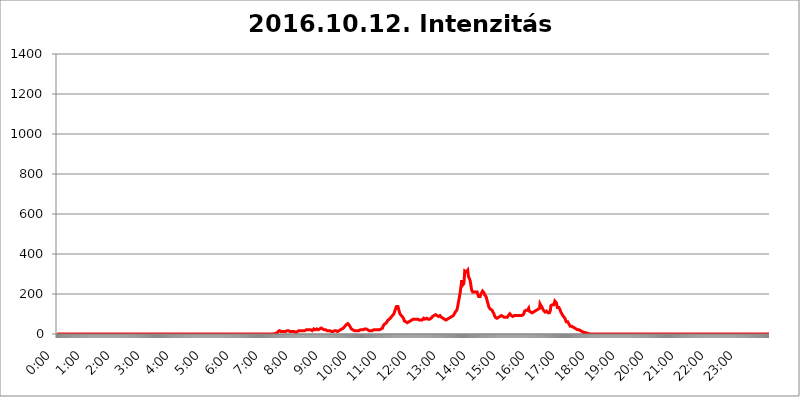
| Category | 2016.10.12. Intenzitás [W/m^2] |
|---|---|
| 0.0 | 0 |
| 0.0006944444444444445 | 0 |
| 0.001388888888888889 | 0 |
| 0.0020833333333333333 | 0 |
| 0.002777777777777778 | 0 |
| 0.003472222222222222 | 0 |
| 0.004166666666666667 | 0 |
| 0.004861111111111111 | 0 |
| 0.005555555555555556 | 0 |
| 0.0062499999999999995 | 0 |
| 0.006944444444444444 | 0 |
| 0.007638888888888889 | 0 |
| 0.008333333333333333 | 0 |
| 0.009027777777777779 | 0 |
| 0.009722222222222222 | 0 |
| 0.010416666666666666 | 0 |
| 0.011111111111111112 | 0 |
| 0.011805555555555555 | 0 |
| 0.012499999999999999 | 0 |
| 0.013194444444444444 | 0 |
| 0.013888888888888888 | 0 |
| 0.014583333333333332 | 0 |
| 0.015277777777777777 | 0 |
| 0.015972222222222224 | 0 |
| 0.016666666666666666 | 0 |
| 0.017361111111111112 | 0 |
| 0.018055555555555557 | 0 |
| 0.01875 | 0 |
| 0.019444444444444445 | 0 |
| 0.02013888888888889 | 0 |
| 0.020833333333333332 | 0 |
| 0.02152777777777778 | 0 |
| 0.022222222222222223 | 0 |
| 0.02291666666666667 | 0 |
| 0.02361111111111111 | 0 |
| 0.024305555555555556 | 0 |
| 0.024999999999999998 | 0 |
| 0.025694444444444447 | 0 |
| 0.02638888888888889 | 0 |
| 0.027083333333333334 | 0 |
| 0.027777777777777776 | 0 |
| 0.02847222222222222 | 0 |
| 0.029166666666666664 | 0 |
| 0.029861111111111113 | 0 |
| 0.030555555555555555 | 0 |
| 0.03125 | 0 |
| 0.03194444444444445 | 0 |
| 0.03263888888888889 | 0 |
| 0.03333333333333333 | 0 |
| 0.034027777777777775 | 0 |
| 0.034722222222222224 | 0 |
| 0.035416666666666666 | 0 |
| 0.036111111111111115 | 0 |
| 0.03680555555555556 | 0 |
| 0.0375 | 0 |
| 0.03819444444444444 | 0 |
| 0.03888888888888889 | 0 |
| 0.03958333333333333 | 0 |
| 0.04027777777777778 | 0 |
| 0.04097222222222222 | 0 |
| 0.041666666666666664 | 0 |
| 0.042361111111111106 | 0 |
| 0.04305555555555556 | 0 |
| 0.043750000000000004 | 0 |
| 0.044444444444444446 | 0 |
| 0.04513888888888889 | 0 |
| 0.04583333333333334 | 0 |
| 0.04652777777777778 | 0 |
| 0.04722222222222222 | 0 |
| 0.04791666666666666 | 0 |
| 0.04861111111111111 | 0 |
| 0.049305555555555554 | 0 |
| 0.049999999999999996 | 0 |
| 0.05069444444444445 | 0 |
| 0.051388888888888894 | 0 |
| 0.052083333333333336 | 0 |
| 0.05277777777777778 | 0 |
| 0.05347222222222222 | 0 |
| 0.05416666666666667 | 0 |
| 0.05486111111111111 | 0 |
| 0.05555555555555555 | 0 |
| 0.05625 | 0 |
| 0.05694444444444444 | 0 |
| 0.057638888888888885 | 0 |
| 0.05833333333333333 | 0 |
| 0.05902777777777778 | 0 |
| 0.059722222222222225 | 0 |
| 0.06041666666666667 | 0 |
| 0.061111111111111116 | 0 |
| 0.06180555555555556 | 0 |
| 0.0625 | 0 |
| 0.06319444444444444 | 0 |
| 0.06388888888888888 | 0 |
| 0.06458333333333334 | 0 |
| 0.06527777777777778 | 0 |
| 0.06597222222222222 | 0 |
| 0.06666666666666667 | 0 |
| 0.06736111111111111 | 0 |
| 0.06805555555555555 | 0 |
| 0.06874999999999999 | 0 |
| 0.06944444444444443 | 0 |
| 0.07013888888888889 | 0 |
| 0.07083333333333333 | 0 |
| 0.07152777777777779 | 0 |
| 0.07222222222222223 | 0 |
| 0.07291666666666667 | 0 |
| 0.07361111111111111 | 0 |
| 0.07430555555555556 | 0 |
| 0.075 | 0 |
| 0.07569444444444444 | 0 |
| 0.0763888888888889 | 0 |
| 0.07708333333333334 | 0 |
| 0.07777777777777778 | 0 |
| 0.07847222222222222 | 0 |
| 0.07916666666666666 | 0 |
| 0.0798611111111111 | 0 |
| 0.08055555555555556 | 0 |
| 0.08125 | 0 |
| 0.08194444444444444 | 0 |
| 0.08263888888888889 | 0 |
| 0.08333333333333333 | 0 |
| 0.08402777777777777 | 0 |
| 0.08472222222222221 | 0 |
| 0.08541666666666665 | 0 |
| 0.08611111111111112 | 0 |
| 0.08680555555555557 | 0 |
| 0.08750000000000001 | 0 |
| 0.08819444444444445 | 0 |
| 0.08888888888888889 | 0 |
| 0.08958333333333333 | 0 |
| 0.09027777777777778 | 0 |
| 0.09097222222222222 | 0 |
| 0.09166666666666667 | 0 |
| 0.09236111111111112 | 0 |
| 0.09305555555555556 | 0 |
| 0.09375 | 0 |
| 0.09444444444444444 | 0 |
| 0.09513888888888888 | 0 |
| 0.09583333333333333 | 0 |
| 0.09652777777777777 | 0 |
| 0.09722222222222222 | 0 |
| 0.09791666666666667 | 0 |
| 0.09861111111111111 | 0 |
| 0.09930555555555555 | 0 |
| 0.09999999999999999 | 0 |
| 0.10069444444444443 | 0 |
| 0.1013888888888889 | 0 |
| 0.10208333333333335 | 0 |
| 0.10277777777777779 | 0 |
| 0.10347222222222223 | 0 |
| 0.10416666666666667 | 0 |
| 0.10486111111111111 | 0 |
| 0.10555555555555556 | 0 |
| 0.10625 | 0 |
| 0.10694444444444444 | 0 |
| 0.1076388888888889 | 0 |
| 0.10833333333333334 | 0 |
| 0.10902777777777778 | 0 |
| 0.10972222222222222 | 0 |
| 0.1111111111111111 | 0 |
| 0.11180555555555556 | 0 |
| 0.11180555555555556 | 0 |
| 0.1125 | 0 |
| 0.11319444444444444 | 0 |
| 0.11388888888888889 | 0 |
| 0.11458333333333333 | 0 |
| 0.11527777777777777 | 0 |
| 0.11597222222222221 | 0 |
| 0.11666666666666665 | 0 |
| 0.1173611111111111 | 0 |
| 0.11805555555555557 | 0 |
| 0.11944444444444445 | 0 |
| 0.12013888888888889 | 0 |
| 0.12083333333333333 | 0 |
| 0.12152777777777778 | 0 |
| 0.12222222222222223 | 0 |
| 0.12291666666666667 | 0 |
| 0.12291666666666667 | 0 |
| 0.12361111111111112 | 0 |
| 0.12430555555555556 | 0 |
| 0.125 | 0 |
| 0.12569444444444444 | 0 |
| 0.12638888888888888 | 0 |
| 0.12708333333333333 | 0 |
| 0.16875 | 0 |
| 0.12847222222222224 | 0 |
| 0.12916666666666668 | 0 |
| 0.12986111111111112 | 0 |
| 0.13055555555555556 | 0 |
| 0.13125 | 0 |
| 0.13194444444444445 | 0 |
| 0.1326388888888889 | 0 |
| 0.13333333333333333 | 0 |
| 0.13402777777777777 | 0 |
| 0.13402777777777777 | 0 |
| 0.13472222222222222 | 0 |
| 0.13541666666666666 | 0 |
| 0.1361111111111111 | 0 |
| 0.13749999999999998 | 0 |
| 0.13819444444444443 | 0 |
| 0.1388888888888889 | 0 |
| 0.13958333333333334 | 0 |
| 0.14027777777777778 | 0 |
| 0.14097222222222222 | 0 |
| 0.14166666666666666 | 0 |
| 0.1423611111111111 | 0 |
| 0.14305555555555557 | 0 |
| 0.14375000000000002 | 0 |
| 0.14444444444444446 | 0 |
| 0.1451388888888889 | 0 |
| 0.1451388888888889 | 0 |
| 0.14652777777777778 | 0 |
| 0.14722222222222223 | 0 |
| 0.14791666666666667 | 0 |
| 0.1486111111111111 | 0 |
| 0.14930555555555555 | 0 |
| 0.15 | 0 |
| 0.15069444444444444 | 0 |
| 0.15138888888888888 | 0 |
| 0.15208333333333332 | 0 |
| 0.15277777777777776 | 0 |
| 0.15347222222222223 | 0 |
| 0.15416666666666667 | 0 |
| 0.15486111111111112 | 0 |
| 0.15555555555555556 | 0 |
| 0.15625 | 0 |
| 0.15694444444444444 | 0 |
| 0.15763888888888888 | 0 |
| 0.15833333333333333 | 0 |
| 0.15902777777777777 | 0 |
| 0.15972222222222224 | 0 |
| 0.16041666666666668 | 0 |
| 0.16111111111111112 | 0 |
| 0.16180555555555556 | 0 |
| 0.1625 | 0 |
| 0.16319444444444445 | 0 |
| 0.1638888888888889 | 0 |
| 0.16458333333333333 | 0 |
| 0.16527777777777777 | 0 |
| 0.16597222222222222 | 0 |
| 0.16666666666666666 | 0 |
| 0.1673611111111111 | 0 |
| 0.16805555555555554 | 0 |
| 0.16874999999999998 | 0 |
| 0.16944444444444443 | 0 |
| 0.17013888888888887 | 0 |
| 0.1708333333333333 | 0 |
| 0.17152777777777775 | 0 |
| 0.17222222222222225 | 0 |
| 0.1729166666666667 | 0 |
| 0.17361111111111113 | 0 |
| 0.17430555555555557 | 0 |
| 0.17500000000000002 | 0 |
| 0.17569444444444446 | 0 |
| 0.1763888888888889 | 0 |
| 0.17708333333333334 | 0 |
| 0.17777777777777778 | 0 |
| 0.17847222222222223 | 0 |
| 0.17916666666666667 | 0 |
| 0.1798611111111111 | 0 |
| 0.18055555555555555 | 0 |
| 0.18125 | 0 |
| 0.18194444444444444 | 0 |
| 0.1826388888888889 | 0 |
| 0.18333333333333335 | 0 |
| 0.1840277777777778 | 0 |
| 0.18472222222222223 | 0 |
| 0.18541666666666667 | 0 |
| 0.18611111111111112 | 0 |
| 0.18680555555555556 | 0 |
| 0.1875 | 0 |
| 0.18819444444444444 | 0 |
| 0.18888888888888888 | 0 |
| 0.18958333333333333 | 0 |
| 0.19027777777777777 | 0 |
| 0.1909722222222222 | 0 |
| 0.19166666666666665 | 0 |
| 0.19236111111111112 | 0 |
| 0.19305555555555554 | 0 |
| 0.19375 | 0 |
| 0.19444444444444445 | 0 |
| 0.1951388888888889 | 0 |
| 0.19583333333333333 | 0 |
| 0.19652777777777777 | 0 |
| 0.19722222222222222 | 0 |
| 0.19791666666666666 | 0 |
| 0.1986111111111111 | 0 |
| 0.19930555555555554 | 0 |
| 0.19999999999999998 | 0 |
| 0.20069444444444443 | 0 |
| 0.20138888888888887 | 0 |
| 0.2020833333333333 | 0 |
| 0.2027777777777778 | 0 |
| 0.2034722222222222 | 0 |
| 0.2041666666666667 | 0 |
| 0.20486111111111113 | 0 |
| 0.20555555555555557 | 0 |
| 0.20625000000000002 | 0 |
| 0.20694444444444446 | 0 |
| 0.2076388888888889 | 0 |
| 0.20833333333333334 | 0 |
| 0.20902777777777778 | 0 |
| 0.20972222222222223 | 0 |
| 0.21041666666666667 | 0 |
| 0.2111111111111111 | 0 |
| 0.21180555555555555 | 0 |
| 0.2125 | 0 |
| 0.21319444444444444 | 0 |
| 0.2138888888888889 | 0 |
| 0.21458333333333335 | 0 |
| 0.2152777777777778 | 0 |
| 0.21597222222222223 | 0 |
| 0.21666666666666667 | 0 |
| 0.21736111111111112 | 0 |
| 0.21805555555555556 | 0 |
| 0.21875 | 0 |
| 0.21944444444444444 | 0 |
| 0.22013888888888888 | 0 |
| 0.22083333333333333 | 0 |
| 0.22152777777777777 | 0 |
| 0.2222222222222222 | 0 |
| 0.22291666666666665 | 0 |
| 0.2236111111111111 | 0 |
| 0.22430555555555556 | 0 |
| 0.225 | 0 |
| 0.22569444444444445 | 0 |
| 0.2263888888888889 | 0 |
| 0.22708333333333333 | 0 |
| 0.22777777777777777 | 0 |
| 0.22847222222222222 | 0 |
| 0.22916666666666666 | 0 |
| 0.2298611111111111 | 0 |
| 0.23055555555555554 | 0 |
| 0.23124999999999998 | 0 |
| 0.23194444444444443 | 0 |
| 0.23263888888888887 | 0 |
| 0.2333333333333333 | 0 |
| 0.2340277777777778 | 0 |
| 0.2347222222222222 | 0 |
| 0.2354166666666667 | 0 |
| 0.23611111111111113 | 0 |
| 0.23680555555555557 | 0 |
| 0.23750000000000002 | 0 |
| 0.23819444444444446 | 0 |
| 0.2388888888888889 | 0 |
| 0.23958333333333334 | 0 |
| 0.24027777777777778 | 0 |
| 0.24097222222222223 | 0 |
| 0.24166666666666667 | 0 |
| 0.2423611111111111 | 0 |
| 0.24305555555555555 | 0 |
| 0.24375 | 0 |
| 0.24444444444444446 | 0 |
| 0.24513888888888888 | 0 |
| 0.24583333333333335 | 0 |
| 0.2465277777777778 | 0 |
| 0.24722222222222223 | 0 |
| 0.24791666666666667 | 0 |
| 0.24861111111111112 | 0 |
| 0.24930555555555556 | 0 |
| 0.25 | 0 |
| 0.25069444444444444 | 0 |
| 0.2513888888888889 | 0 |
| 0.2520833333333333 | 0 |
| 0.25277777777777777 | 0 |
| 0.2534722222222222 | 0 |
| 0.25416666666666665 | 0 |
| 0.2548611111111111 | 0 |
| 0.2555555555555556 | 0 |
| 0.25625000000000003 | 0 |
| 0.2569444444444445 | 0 |
| 0.2576388888888889 | 0 |
| 0.25833333333333336 | 0 |
| 0.2590277777777778 | 0 |
| 0.25972222222222224 | 0 |
| 0.2604166666666667 | 0 |
| 0.2611111111111111 | 0 |
| 0.26180555555555557 | 0 |
| 0.2625 | 0 |
| 0.26319444444444445 | 0 |
| 0.2638888888888889 | 0 |
| 0.26458333333333334 | 0 |
| 0.2652777777777778 | 0 |
| 0.2659722222222222 | 0 |
| 0.26666666666666666 | 0 |
| 0.2673611111111111 | 0 |
| 0.26805555555555555 | 0 |
| 0.26875 | 0 |
| 0.26944444444444443 | 0 |
| 0.2701388888888889 | 0 |
| 0.2708333333333333 | 0 |
| 0.27152777777777776 | 0 |
| 0.2722222222222222 | 0 |
| 0.27291666666666664 | 0 |
| 0.2736111111111111 | 0 |
| 0.2743055555555555 | 0 |
| 0.27499999999999997 | 0 |
| 0.27569444444444446 | 0 |
| 0.27638888888888885 | 0 |
| 0.27708333333333335 | 0 |
| 0.2777777777777778 | 0 |
| 0.27847222222222223 | 0 |
| 0.2791666666666667 | 0 |
| 0.2798611111111111 | 0 |
| 0.28055555555555556 | 0 |
| 0.28125 | 0 |
| 0.28194444444444444 | 0 |
| 0.2826388888888889 | 0 |
| 0.2833333333333333 | 0 |
| 0.28402777777777777 | 0 |
| 0.2847222222222222 | 0 |
| 0.28541666666666665 | 0 |
| 0.28611111111111115 | 0 |
| 0.28680555555555554 | 0 |
| 0.28750000000000003 | 0 |
| 0.2881944444444445 | 0 |
| 0.2888888888888889 | 0 |
| 0.28958333333333336 | 0 |
| 0.2902777777777778 | 0 |
| 0.29097222222222224 | 0 |
| 0.2916666666666667 | 0 |
| 0.2923611111111111 | 0 |
| 0.29305555555555557 | 0 |
| 0.29375 | 0 |
| 0.29444444444444445 | 0 |
| 0.2951388888888889 | 0 |
| 0.29583333333333334 | 0 |
| 0.2965277777777778 | 0 |
| 0.2972222222222222 | 0 |
| 0.29791666666666666 | 0 |
| 0.2986111111111111 | 0 |
| 0.29930555555555555 | 0 |
| 0.3 | 0 |
| 0.30069444444444443 | 0 |
| 0.3013888888888889 | 0 |
| 0.3020833333333333 | 0 |
| 0.30277777777777776 | 0 |
| 0.3034722222222222 | 0 |
| 0.30416666666666664 | 0 |
| 0.3048611111111111 | 0 |
| 0.3055555555555555 | 0 |
| 0.30624999999999997 | 3.525 |
| 0.3069444444444444 | 3.525 |
| 0.3076388888888889 | 3.525 |
| 0.30833333333333335 | 3.525 |
| 0.3090277777777778 | 7.887 |
| 0.30972222222222223 | 12.257 |
| 0.3104166666666667 | 12.257 |
| 0.3111111111111111 | 16.636 |
| 0.31180555555555556 | 16.636 |
| 0.3125 | 16.636 |
| 0.31319444444444444 | 16.636 |
| 0.3138888888888889 | 12.257 |
| 0.3145833333333333 | 12.257 |
| 0.31527777777777777 | 12.257 |
| 0.3159722222222222 | 12.257 |
| 0.31666666666666665 | 12.257 |
| 0.31736111111111115 | 12.257 |
| 0.31805555555555554 | 12.257 |
| 0.31875000000000003 | 12.257 |
| 0.3194444444444445 | 12.257 |
| 0.3201388888888889 | 12.257 |
| 0.32083333333333336 | 16.636 |
| 0.3215277777777778 | 16.636 |
| 0.32222222222222224 | 16.636 |
| 0.3229166666666667 | 16.636 |
| 0.3236111111111111 | 16.636 |
| 0.32430555555555557 | 16.636 |
| 0.325 | 16.636 |
| 0.32569444444444445 | 12.257 |
| 0.3263888888888889 | 12.257 |
| 0.32708333333333334 | 12.257 |
| 0.3277777777777778 | 12.257 |
| 0.3284722222222222 | 12.257 |
| 0.32916666666666666 | 12.257 |
| 0.3298611111111111 | 12.257 |
| 0.33055555555555555 | 12.257 |
| 0.33125 | 12.257 |
| 0.33194444444444443 | 7.887 |
| 0.3326388888888889 | 12.257 |
| 0.3333333333333333 | 7.887 |
| 0.3340277777777778 | 7.887 |
| 0.3347222222222222 | 7.887 |
| 0.3354166666666667 | 7.887 |
| 0.3361111111111111 | 12.257 |
| 0.3368055555555556 | 12.257 |
| 0.33749999999999997 | 12.257 |
| 0.33819444444444446 | 16.636 |
| 0.33888888888888885 | 16.636 |
| 0.33958333333333335 | 16.636 |
| 0.34027777777777773 | 16.636 |
| 0.34097222222222223 | 16.636 |
| 0.3416666666666666 | 16.636 |
| 0.3423611111111111 | 16.636 |
| 0.3430555555555555 | 16.636 |
| 0.34375 | 16.636 |
| 0.3444444444444445 | 16.636 |
| 0.3451388888888889 | 16.636 |
| 0.3458333333333334 | 16.636 |
| 0.34652777777777777 | 16.636 |
| 0.34722222222222227 | 16.636 |
| 0.34791666666666665 | 16.636 |
| 0.34861111111111115 | 16.636 |
| 0.34930555555555554 | 21.024 |
| 0.35000000000000003 | 21.024 |
| 0.3506944444444444 | 21.024 |
| 0.3513888888888889 | 21.024 |
| 0.3520833333333333 | 21.024 |
| 0.3527777777777778 | 21.024 |
| 0.3534722222222222 | 21.024 |
| 0.3541666666666667 | 21.024 |
| 0.3548611111111111 | 21.024 |
| 0.35555555555555557 | 21.024 |
| 0.35625 | 21.024 |
| 0.35694444444444445 | 16.636 |
| 0.3576388888888889 | 16.636 |
| 0.35833333333333334 | 21.024 |
| 0.3590277777777778 | 21.024 |
| 0.3597222222222222 | 25.419 |
| 0.36041666666666666 | 25.419 |
| 0.3611111111111111 | 25.419 |
| 0.36180555555555555 | 21.024 |
| 0.3625 | 21.024 |
| 0.36319444444444443 | 21.024 |
| 0.3638888888888889 | 25.419 |
| 0.3645833333333333 | 25.419 |
| 0.3652777777777778 | 21.024 |
| 0.3659722222222222 | 21.024 |
| 0.3666666666666667 | 21.024 |
| 0.3673611111111111 | 21.024 |
| 0.3680555555555556 | 25.419 |
| 0.36874999999999997 | 25.419 |
| 0.36944444444444446 | 25.419 |
| 0.37013888888888885 | 29.823 |
| 0.37083333333333335 | 29.823 |
| 0.37152777777777773 | 29.823 |
| 0.37222222222222223 | 25.419 |
| 0.3729166666666666 | 21.024 |
| 0.3736111111111111 | 21.024 |
| 0.3743055555555555 | 21.024 |
| 0.375 | 21.024 |
| 0.3756944444444445 | 21.024 |
| 0.3763888888888889 | 21.024 |
| 0.3770833333333334 | 16.636 |
| 0.37777777777777777 | 16.636 |
| 0.37847222222222227 | 16.636 |
| 0.37916666666666665 | 16.636 |
| 0.37986111111111115 | 16.636 |
| 0.38055555555555554 | 16.636 |
| 0.38125000000000003 | 16.636 |
| 0.3819444444444444 | 16.636 |
| 0.3826388888888889 | 16.636 |
| 0.3833333333333333 | 16.636 |
| 0.3840277777777778 | 16.636 |
| 0.3847222222222222 | 12.257 |
| 0.3854166666666667 | 16.636 |
| 0.3861111111111111 | 12.257 |
| 0.38680555555555557 | 12.257 |
| 0.3875 | 12.257 |
| 0.38819444444444445 | 16.636 |
| 0.3888888888888889 | 16.636 |
| 0.38958333333333334 | 16.636 |
| 0.3902777777777778 | 16.636 |
| 0.3909722222222222 | 16.636 |
| 0.39166666666666666 | 16.636 |
| 0.3923611111111111 | 12.257 |
| 0.39305555555555555 | 12.257 |
| 0.39375 | 12.257 |
| 0.39444444444444443 | 12.257 |
| 0.3951388888888889 | 16.636 |
| 0.3958333333333333 | 16.636 |
| 0.3965277777777778 | 21.024 |
| 0.3972222222222222 | 21.024 |
| 0.3979166666666667 | 21.024 |
| 0.3986111111111111 | 21.024 |
| 0.3993055555555556 | 25.419 |
| 0.39999999999999997 | 25.419 |
| 0.40069444444444446 | 25.419 |
| 0.40138888888888885 | 29.823 |
| 0.40208333333333335 | 29.823 |
| 0.40277777777777773 | 34.234 |
| 0.40347222222222223 | 38.653 |
| 0.4041666666666666 | 38.653 |
| 0.4048611111111111 | 43.079 |
| 0.4055555555555555 | 47.511 |
| 0.40625 | 47.511 |
| 0.4069444444444445 | 51.951 |
| 0.4076388888888889 | 51.951 |
| 0.4083333333333334 | 51.951 |
| 0.40902777777777777 | 47.511 |
| 0.40972222222222227 | 43.079 |
| 0.41041666666666665 | 38.653 |
| 0.41111111111111115 | 34.234 |
| 0.41180555555555554 | 29.823 |
| 0.41250000000000003 | 25.419 |
| 0.4131944444444444 | 21.024 |
| 0.4138888888888889 | 21.024 |
| 0.4145833333333333 | 21.024 |
| 0.4152777777777778 | 16.636 |
| 0.4159722222222222 | 16.636 |
| 0.4166666666666667 | 16.636 |
| 0.4173611111111111 | 16.636 |
| 0.41805555555555557 | 16.636 |
| 0.41875 | 16.636 |
| 0.41944444444444445 | 16.636 |
| 0.4201388888888889 | 16.636 |
| 0.42083333333333334 | 16.636 |
| 0.4215277777777778 | 16.636 |
| 0.4222222222222222 | 16.636 |
| 0.42291666666666666 | 16.636 |
| 0.4236111111111111 | 21.024 |
| 0.42430555555555555 | 21.024 |
| 0.425 | 21.024 |
| 0.42569444444444443 | 21.024 |
| 0.4263888888888889 | 21.024 |
| 0.4270833333333333 | 21.024 |
| 0.4277777777777778 | 21.024 |
| 0.4284722222222222 | 21.024 |
| 0.4291666666666667 | 21.024 |
| 0.4298611111111111 | 21.024 |
| 0.4305555555555556 | 25.419 |
| 0.43124999999999997 | 25.419 |
| 0.43194444444444446 | 25.419 |
| 0.43263888888888885 | 25.419 |
| 0.43333333333333335 | 25.419 |
| 0.43402777777777773 | 25.419 |
| 0.43472222222222223 | 25.419 |
| 0.4354166666666666 | 21.024 |
| 0.4361111111111111 | 21.024 |
| 0.4368055555555555 | 21.024 |
| 0.4375 | 16.636 |
| 0.4381944444444445 | 16.636 |
| 0.4388888888888889 | 16.636 |
| 0.4395833333333334 | 16.636 |
| 0.44027777777777777 | 16.636 |
| 0.44097222222222227 | 16.636 |
| 0.44166666666666665 | 16.636 |
| 0.44236111111111115 | 21.024 |
| 0.44305555555555554 | 21.024 |
| 0.44375000000000003 | 21.024 |
| 0.4444444444444444 | 21.024 |
| 0.4451388888888889 | 21.024 |
| 0.4458333333333333 | 21.024 |
| 0.4465277777777778 | 21.024 |
| 0.4472222222222222 | 21.024 |
| 0.4479166666666667 | 21.024 |
| 0.4486111111111111 | 21.024 |
| 0.44930555555555557 | 21.024 |
| 0.45 | 21.024 |
| 0.45069444444444445 | 21.024 |
| 0.4513888888888889 | 21.024 |
| 0.45208333333333334 | 21.024 |
| 0.4527777777777778 | 21.024 |
| 0.4534722222222222 | 21.024 |
| 0.45416666666666666 | 25.419 |
| 0.4548611111111111 | 25.419 |
| 0.45555555555555555 | 29.823 |
| 0.45625 | 29.823 |
| 0.45694444444444443 | 38.653 |
| 0.4576388888888889 | 43.079 |
| 0.4583333333333333 | 47.511 |
| 0.4590277777777778 | 47.511 |
| 0.4597222222222222 | 47.511 |
| 0.4604166666666667 | 51.951 |
| 0.4611111111111111 | 51.951 |
| 0.4618055555555556 | 56.398 |
| 0.46249999999999997 | 60.85 |
| 0.46319444444444446 | 65.31 |
| 0.46388888888888885 | 69.775 |
| 0.46458333333333335 | 69.775 |
| 0.46527777777777773 | 74.246 |
| 0.46597222222222223 | 74.246 |
| 0.4666666666666666 | 74.246 |
| 0.4673611111111111 | 78.722 |
| 0.4680555555555555 | 83.205 |
| 0.46875 | 83.205 |
| 0.4694444444444445 | 87.692 |
| 0.4701388888888889 | 92.184 |
| 0.4708333333333334 | 96.682 |
| 0.47152777777777777 | 96.682 |
| 0.47222222222222227 | 101.184 |
| 0.47291666666666665 | 110.201 |
| 0.47361111111111115 | 114.716 |
| 0.47430555555555554 | 123.758 |
| 0.47500000000000003 | 128.284 |
| 0.4756944444444444 | 137.347 |
| 0.4763888888888889 | 137.347 |
| 0.4770833333333333 | 141.884 |
| 0.4777777777777778 | 137.347 |
| 0.4784722222222222 | 128.284 |
| 0.4791666666666667 | 119.235 |
| 0.4798611111111111 | 110.201 |
| 0.48055555555555557 | 101.184 |
| 0.48125 | 96.682 |
| 0.48194444444444445 | 96.682 |
| 0.4826388888888889 | 92.184 |
| 0.48333333333333334 | 92.184 |
| 0.4840277777777778 | 92.184 |
| 0.4847222222222222 | 83.205 |
| 0.48541666666666666 | 78.722 |
| 0.4861111111111111 | 74.246 |
| 0.48680555555555555 | 65.31 |
| 0.4875 | 65.31 |
| 0.48819444444444443 | 60.85 |
| 0.4888888888888889 | 60.85 |
| 0.4895833333333333 | 60.85 |
| 0.4902777777777778 | 56.398 |
| 0.4909722222222222 | 56.398 |
| 0.4916666666666667 | 56.398 |
| 0.4923611111111111 | 56.398 |
| 0.4930555555555556 | 60.85 |
| 0.49374999999999997 | 65.31 |
| 0.49444444444444446 | 65.31 |
| 0.49513888888888885 | 65.31 |
| 0.49583333333333335 | 69.775 |
| 0.49652777777777773 | 69.775 |
| 0.49722222222222223 | 69.775 |
| 0.4979166666666666 | 69.775 |
| 0.4986111111111111 | 69.775 |
| 0.4993055555555555 | 74.246 |
| 0.5 | 74.246 |
| 0.5006944444444444 | 74.246 |
| 0.5013888888888889 | 74.246 |
| 0.5020833333333333 | 74.246 |
| 0.5027777777777778 | 74.246 |
| 0.5034722222222222 | 74.246 |
| 0.5041666666666667 | 78.722 |
| 0.5048611111111111 | 74.246 |
| 0.5055555555555555 | 74.246 |
| 0.50625 | 74.246 |
| 0.5069444444444444 | 69.775 |
| 0.5076388888888889 | 69.775 |
| 0.5083333333333333 | 69.775 |
| 0.5090277777777777 | 69.775 |
| 0.5097222222222222 | 69.775 |
| 0.5104166666666666 | 69.775 |
| 0.5111111111111112 | 69.775 |
| 0.5118055555555555 | 69.775 |
| 0.5125000000000001 | 69.775 |
| 0.5131944444444444 | 74.246 |
| 0.513888888888889 | 78.722 |
| 0.5145833333333333 | 78.722 |
| 0.5152777777777778 | 78.722 |
| 0.5159722222222222 | 74.246 |
| 0.5166666666666667 | 74.246 |
| 0.517361111111111 | 74.246 |
| 0.5180555555555556 | 78.722 |
| 0.5187499999999999 | 78.722 |
| 0.5194444444444445 | 78.722 |
| 0.5201388888888888 | 74.246 |
| 0.5208333333333334 | 74.246 |
| 0.5215277777777778 | 74.246 |
| 0.5222222222222223 | 74.246 |
| 0.5229166666666667 | 69.775 |
| 0.5236111111111111 | 74.246 |
| 0.5243055555555556 | 78.722 |
| 0.525 | 78.722 |
| 0.5256944444444445 | 83.205 |
| 0.5263888888888889 | 87.692 |
| 0.5270833333333333 | 92.184 |
| 0.5277777777777778 | 92.184 |
| 0.5284722222222222 | 92.184 |
| 0.5291666666666667 | 96.682 |
| 0.5298611111111111 | 96.682 |
| 0.5305555555555556 | 96.682 |
| 0.53125 | 96.682 |
| 0.5319444444444444 | 92.184 |
| 0.5326388888888889 | 92.184 |
| 0.5333333333333333 | 87.692 |
| 0.5340277777777778 | 87.692 |
| 0.5347222222222222 | 87.692 |
| 0.5354166666666667 | 92.184 |
| 0.5361111111111111 | 92.184 |
| 0.5368055555555555 | 92.184 |
| 0.5375 | 92.184 |
| 0.5381944444444444 | 87.692 |
| 0.5388888888888889 | 83.205 |
| 0.5395833333333333 | 83.205 |
| 0.5402777777777777 | 78.722 |
| 0.5409722222222222 | 78.722 |
| 0.5416666666666666 | 74.246 |
| 0.5423611111111112 | 74.246 |
| 0.5430555555555555 | 74.246 |
| 0.5437500000000001 | 74.246 |
| 0.5444444444444444 | 74.246 |
| 0.545138888888889 | 69.775 |
| 0.5458333333333333 | 69.775 |
| 0.5465277777777778 | 74.246 |
| 0.5472222222222222 | 74.246 |
| 0.5479166666666667 | 74.246 |
| 0.548611111111111 | 78.722 |
| 0.5493055555555556 | 78.722 |
| 0.5499999999999999 | 78.722 |
| 0.5506944444444445 | 78.722 |
| 0.5513888888888888 | 83.205 |
| 0.5520833333333334 | 83.205 |
| 0.5527777777777778 | 83.205 |
| 0.5534722222222223 | 87.692 |
| 0.5541666666666667 | 87.692 |
| 0.5548611111111111 | 92.184 |
| 0.5555555555555556 | 92.184 |
| 0.55625 | 96.682 |
| 0.5569444444444445 | 101.184 |
| 0.5576388888888889 | 105.69 |
| 0.5583333333333333 | 110.201 |
| 0.5590277777777778 | 110.201 |
| 0.5597222222222222 | 114.716 |
| 0.5604166666666667 | 119.235 |
| 0.5611111111111111 | 128.284 |
| 0.5618055555555556 | 141.884 |
| 0.5625 | 155.509 |
| 0.5631944444444444 | 169.156 |
| 0.5638888888888889 | 182.82 |
| 0.5645833333333333 | 196.497 |
| 0.5652777777777778 | 210.182 |
| 0.5659722222222222 | 233 |
| 0.5666666666666667 | 246.689 |
| 0.5673611111111111 | 269.49 |
| 0.5680555555555555 | 242.127 |
| 0.56875 | 237.564 |
| 0.5694444444444444 | 242.127 |
| 0.5701388888888889 | 251.251 |
| 0.5708333333333333 | 274.047 |
| 0.5715277777777777 | 314.98 |
| 0.5722222222222222 | 319.517 |
| 0.5729166666666666 | 314.98 |
| 0.5736111111111112 | 310.44 |
| 0.5743055555555555 | 314.98 |
| 0.5750000000000001 | 314.98 |
| 0.5756944444444444 | 319.517 |
| 0.576388888888889 | 296.808 |
| 0.5770833333333333 | 283.156 |
| 0.5777777777777778 | 278.603 |
| 0.5784722222222222 | 274.047 |
| 0.5791666666666667 | 264.932 |
| 0.579861111111111 | 251.251 |
| 0.5805555555555556 | 233 |
| 0.5812499999999999 | 219.309 |
| 0.5819444444444445 | 214.746 |
| 0.5826388888888888 | 210.182 |
| 0.5833333333333334 | 205.62 |
| 0.5840277777777778 | 205.62 |
| 0.5847222222222223 | 210.182 |
| 0.5854166666666667 | 210.182 |
| 0.5861111111111111 | 210.182 |
| 0.5868055555555556 | 210.182 |
| 0.5875 | 210.182 |
| 0.5881944444444445 | 210.182 |
| 0.5888888888888889 | 210.182 |
| 0.5895833333333333 | 201.058 |
| 0.5902777777777778 | 196.497 |
| 0.5909722222222222 | 187.378 |
| 0.5916666666666667 | 182.82 |
| 0.5923611111111111 | 182.82 |
| 0.5930555555555556 | 187.378 |
| 0.59375 | 191.937 |
| 0.5944444444444444 | 201.058 |
| 0.5951388888888889 | 201.058 |
| 0.5958333333333333 | 205.62 |
| 0.5965277777777778 | 214.746 |
| 0.5972222222222222 | 214.746 |
| 0.5979166666666667 | 210.182 |
| 0.5986111111111111 | 205.62 |
| 0.5993055555555555 | 196.497 |
| 0.6 | 191.937 |
| 0.6006944444444444 | 191.937 |
| 0.6013888888888889 | 187.378 |
| 0.6020833333333333 | 178.264 |
| 0.6027777777777777 | 169.156 |
| 0.6034722222222222 | 160.056 |
| 0.6041666666666666 | 150.964 |
| 0.6048611111111112 | 141.884 |
| 0.6055555555555555 | 132.814 |
| 0.6062500000000001 | 128.284 |
| 0.6069444444444444 | 128.284 |
| 0.607638888888889 | 123.758 |
| 0.6083333333333333 | 123.758 |
| 0.6090277777777778 | 119.235 |
| 0.6097222222222222 | 119.235 |
| 0.6104166666666667 | 114.716 |
| 0.611111111111111 | 110.201 |
| 0.6118055555555556 | 105.69 |
| 0.6124999999999999 | 101.184 |
| 0.6131944444444445 | 92.184 |
| 0.6138888888888888 | 87.692 |
| 0.6145833333333334 | 83.205 |
| 0.6152777777777778 | 83.205 |
| 0.6159722222222223 | 78.722 |
| 0.6166666666666667 | 78.722 |
| 0.6173611111111111 | 78.722 |
| 0.6180555555555556 | 78.722 |
| 0.61875 | 83.205 |
| 0.6194444444444445 | 83.205 |
| 0.6201388888888889 | 87.692 |
| 0.6208333333333333 | 87.692 |
| 0.6215277777777778 | 92.184 |
| 0.6222222222222222 | 92.184 |
| 0.6229166666666667 | 92.184 |
| 0.6236111111111111 | 92.184 |
| 0.6243055555555556 | 87.692 |
| 0.625 | 87.692 |
| 0.6256944444444444 | 87.692 |
| 0.6263888888888889 | 87.692 |
| 0.6270833333333333 | 83.205 |
| 0.6277777777777778 | 83.205 |
| 0.6284722222222222 | 83.205 |
| 0.6291666666666667 | 83.205 |
| 0.6298611111111111 | 83.205 |
| 0.6305555555555555 | 83.205 |
| 0.63125 | 83.205 |
| 0.6319444444444444 | 87.692 |
| 0.6326388888888889 | 92.184 |
| 0.6333333333333333 | 96.682 |
| 0.6340277777777777 | 96.682 |
| 0.6347222222222222 | 101.184 |
| 0.6354166666666666 | 101.184 |
| 0.6361111111111112 | 96.682 |
| 0.6368055555555555 | 92.184 |
| 0.6375000000000001 | 92.184 |
| 0.6381944444444444 | 87.692 |
| 0.638888888888889 | 87.692 |
| 0.6395833333333333 | 92.184 |
| 0.6402777777777778 | 92.184 |
| 0.6409722222222222 | 92.184 |
| 0.6416666666666667 | 92.184 |
| 0.642361111111111 | 92.184 |
| 0.6430555555555556 | 92.184 |
| 0.6437499999999999 | 92.184 |
| 0.6444444444444445 | 96.682 |
| 0.6451388888888888 | 92.184 |
| 0.6458333333333334 | 92.184 |
| 0.6465277777777778 | 92.184 |
| 0.6472222222222223 | 92.184 |
| 0.6479166666666667 | 92.184 |
| 0.6486111111111111 | 92.184 |
| 0.6493055555555556 | 92.184 |
| 0.65 | 92.184 |
| 0.6506944444444445 | 92.184 |
| 0.6513888888888889 | 92.184 |
| 0.6520833333333333 | 96.682 |
| 0.6527777777777778 | 96.682 |
| 0.6534722222222222 | 96.682 |
| 0.6541666666666667 | 101.184 |
| 0.6548611111111111 | 105.69 |
| 0.6555555555555556 | 114.716 |
| 0.65625 | 114.716 |
| 0.6569444444444444 | 114.716 |
| 0.6576388888888889 | 119.235 |
| 0.6583333333333333 | 119.235 |
| 0.6590277777777778 | 119.235 |
| 0.6597222222222222 | 119.235 |
| 0.6604166666666667 | 119.235 |
| 0.6611111111111111 | 128.284 |
| 0.6618055555555555 | 114.716 |
| 0.6625 | 114.716 |
| 0.6631944444444444 | 110.201 |
| 0.6638888888888889 | 110.201 |
| 0.6645833333333333 | 105.69 |
| 0.6652777777777777 | 105.69 |
| 0.6659722222222222 | 105.69 |
| 0.6666666666666666 | 105.69 |
| 0.6673611111111111 | 110.201 |
| 0.6680555555555556 | 110.201 |
| 0.6687500000000001 | 110.201 |
| 0.6694444444444444 | 110.201 |
| 0.6701388888888888 | 114.716 |
| 0.6708333333333334 | 114.716 |
| 0.6715277777777778 | 119.235 |
| 0.6722222222222222 | 119.235 |
| 0.6729166666666666 | 123.758 |
| 0.6736111111111112 | 123.758 |
| 0.6743055555555556 | 123.758 |
| 0.6749999999999999 | 128.284 |
| 0.6756944444444444 | 128.284 |
| 0.6763888888888889 | 128.284 |
| 0.6770833333333334 | 150.964 |
| 0.6777777777777777 | 150.964 |
| 0.6784722222222223 | 141.884 |
| 0.6791666666666667 | 137.347 |
| 0.6798611111111111 | 132.814 |
| 0.6805555555555555 | 132.814 |
| 0.68125 | 128.284 |
| 0.6819444444444445 | 119.235 |
| 0.6826388888888889 | 119.235 |
| 0.6833333333333332 | 114.716 |
| 0.6840277777777778 | 110.201 |
| 0.6847222222222222 | 110.201 |
| 0.6854166666666667 | 110.201 |
| 0.686111111111111 | 114.716 |
| 0.6868055555555556 | 119.235 |
| 0.6875 | 110.201 |
| 0.6881944444444444 | 105.69 |
| 0.688888888888889 | 105.69 |
| 0.6895833333333333 | 105.69 |
| 0.6902777777777778 | 105.69 |
| 0.6909722222222222 | 110.201 |
| 0.6916666666666668 | 119.235 |
| 0.6923611111111111 | 141.884 |
| 0.6930555555555555 | 141.884 |
| 0.69375 | 137.347 |
| 0.6944444444444445 | 146.423 |
| 0.6951388888888889 | 146.423 |
| 0.6958333333333333 | 146.423 |
| 0.6965277777777777 | 146.423 |
| 0.6972222222222223 | 155.509 |
| 0.6979166666666666 | 164.605 |
| 0.6986111111111111 | 164.605 |
| 0.6993055555555556 | 160.056 |
| 0.7000000000000001 | 155.509 |
| 0.7006944444444444 | 146.423 |
| 0.7013888888888888 | 132.814 |
| 0.7020833333333334 | 137.347 |
| 0.7027777777777778 | 137.347 |
| 0.7034722222222222 | 132.814 |
| 0.7041666666666666 | 128.284 |
| 0.7048611111111112 | 123.758 |
| 0.7055555555555556 | 119.235 |
| 0.7062499999999999 | 110.201 |
| 0.7069444444444444 | 105.69 |
| 0.7076388888888889 | 101.184 |
| 0.7083333333333334 | 96.682 |
| 0.7090277777777777 | 92.184 |
| 0.7097222222222223 | 92.184 |
| 0.7104166666666667 | 87.692 |
| 0.7111111111111111 | 83.205 |
| 0.7118055555555555 | 78.722 |
| 0.7125 | 74.246 |
| 0.7131944444444445 | 69.775 |
| 0.7138888888888889 | 60.85 |
| 0.7145833333333332 | 56.398 |
| 0.7152777777777778 | 56.398 |
| 0.7159722222222222 | 60.85 |
| 0.7166666666666667 | 60.85 |
| 0.717361111111111 | 56.398 |
| 0.7180555555555556 | 47.511 |
| 0.71875 | 43.079 |
| 0.7194444444444444 | 38.653 |
| 0.720138888888889 | 38.653 |
| 0.7208333333333333 | 38.653 |
| 0.7215277777777778 | 38.653 |
| 0.7222222222222222 | 34.234 |
| 0.7229166666666668 | 34.234 |
| 0.7236111111111111 | 34.234 |
| 0.7243055555555555 | 29.823 |
| 0.725 | 29.823 |
| 0.7256944444444445 | 29.823 |
| 0.7263888888888889 | 29.823 |
| 0.7270833333333333 | 25.419 |
| 0.7277777777777777 | 25.419 |
| 0.7284722222222223 | 25.419 |
| 0.7291666666666666 | 25.419 |
| 0.7298611111111111 | 21.024 |
| 0.7305555555555556 | 21.024 |
| 0.7312500000000001 | 21.024 |
| 0.7319444444444444 | 21.024 |
| 0.7326388888888888 | 16.636 |
| 0.7333333333333334 | 16.636 |
| 0.7340277777777778 | 16.636 |
| 0.7347222222222222 | 12.257 |
| 0.7354166666666666 | 12.257 |
| 0.7361111111111112 | 12.257 |
| 0.7368055555555556 | 12.257 |
| 0.7374999999999999 | 12.257 |
| 0.7381944444444444 | 7.887 |
| 0.7388888888888889 | 7.887 |
| 0.7395833333333334 | 7.887 |
| 0.7402777777777777 | 7.887 |
| 0.7409722222222223 | 3.525 |
| 0.7416666666666667 | 3.525 |
| 0.7423611111111111 | 3.525 |
| 0.7430555555555555 | 3.525 |
| 0.74375 | 3.525 |
| 0.7444444444444445 | 3.525 |
| 0.7451388888888889 | 3.525 |
| 0.7458333333333332 | 0 |
| 0.7465277777777778 | 0 |
| 0.7472222222222222 | 0 |
| 0.7479166666666667 | 0 |
| 0.748611111111111 | 0 |
| 0.7493055555555556 | 0 |
| 0.75 | 0 |
| 0.7506944444444444 | 0 |
| 0.751388888888889 | 0 |
| 0.7520833333333333 | 0 |
| 0.7527777777777778 | 0 |
| 0.7534722222222222 | 0 |
| 0.7541666666666668 | 0 |
| 0.7548611111111111 | 0 |
| 0.7555555555555555 | 0 |
| 0.75625 | 0 |
| 0.7569444444444445 | 0 |
| 0.7576388888888889 | 0 |
| 0.7583333333333333 | 0 |
| 0.7590277777777777 | 0 |
| 0.7597222222222223 | 0 |
| 0.7604166666666666 | 0 |
| 0.7611111111111111 | 0 |
| 0.7618055555555556 | 0 |
| 0.7625000000000001 | 0 |
| 0.7631944444444444 | 0 |
| 0.7638888888888888 | 0 |
| 0.7645833333333334 | 0 |
| 0.7652777777777778 | 0 |
| 0.7659722222222222 | 0 |
| 0.7666666666666666 | 0 |
| 0.7673611111111112 | 0 |
| 0.7680555555555556 | 0 |
| 0.7687499999999999 | 0 |
| 0.7694444444444444 | 0 |
| 0.7701388888888889 | 0 |
| 0.7708333333333334 | 0 |
| 0.7715277777777777 | 0 |
| 0.7722222222222223 | 0 |
| 0.7729166666666667 | 0 |
| 0.7736111111111111 | 0 |
| 0.7743055555555555 | 0 |
| 0.775 | 0 |
| 0.7756944444444445 | 0 |
| 0.7763888888888889 | 0 |
| 0.7770833333333332 | 0 |
| 0.7777777777777778 | 0 |
| 0.7784722222222222 | 0 |
| 0.7791666666666667 | 0 |
| 0.779861111111111 | 0 |
| 0.7805555555555556 | 0 |
| 0.78125 | 0 |
| 0.7819444444444444 | 0 |
| 0.782638888888889 | 0 |
| 0.7833333333333333 | 0 |
| 0.7840277777777778 | 0 |
| 0.7847222222222222 | 0 |
| 0.7854166666666668 | 0 |
| 0.7861111111111111 | 0 |
| 0.7868055555555555 | 0 |
| 0.7875 | 0 |
| 0.7881944444444445 | 0 |
| 0.7888888888888889 | 0 |
| 0.7895833333333333 | 0 |
| 0.7902777777777777 | 0 |
| 0.7909722222222223 | 0 |
| 0.7916666666666666 | 0 |
| 0.7923611111111111 | 0 |
| 0.7930555555555556 | 0 |
| 0.7937500000000001 | 0 |
| 0.7944444444444444 | 0 |
| 0.7951388888888888 | 0 |
| 0.7958333333333334 | 0 |
| 0.7965277777777778 | 0 |
| 0.7972222222222222 | 0 |
| 0.7979166666666666 | 0 |
| 0.7986111111111112 | 0 |
| 0.7993055555555556 | 0 |
| 0.7999999999999999 | 0 |
| 0.8006944444444444 | 0 |
| 0.8013888888888889 | 0 |
| 0.8020833333333334 | 0 |
| 0.8027777777777777 | 0 |
| 0.8034722222222223 | 0 |
| 0.8041666666666667 | 0 |
| 0.8048611111111111 | 0 |
| 0.8055555555555555 | 0 |
| 0.80625 | 0 |
| 0.8069444444444445 | 0 |
| 0.8076388888888889 | 0 |
| 0.8083333333333332 | 0 |
| 0.8090277777777778 | 0 |
| 0.8097222222222222 | 0 |
| 0.8104166666666667 | 0 |
| 0.811111111111111 | 0 |
| 0.8118055555555556 | 0 |
| 0.8125 | 0 |
| 0.8131944444444444 | 0 |
| 0.813888888888889 | 0 |
| 0.8145833333333333 | 0 |
| 0.8152777777777778 | 0 |
| 0.8159722222222222 | 0 |
| 0.8166666666666668 | 0 |
| 0.8173611111111111 | 0 |
| 0.8180555555555555 | 0 |
| 0.81875 | 0 |
| 0.8194444444444445 | 0 |
| 0.8201388888888889 | 0 |
| 0.8208333333333333 | 0 |
| 0.8215277777777777 | 0 |
| 0.8222222222222223 | 0 |
| 0.8229166666666666 | 0 |
| 0.8236111111111111 | 0 |
| 0.8243055555555556 | 0 |
| 0.8250000000000001 | 0 |
| 0.8256944444444444 | 0 |
| 0.8263888888888888 | 0 |
| 0.8270833333333334 | 0 |
| 0.8277777777777778 | 0 |
| 0.8284722222222222 | 0 |
| 0.8291666666666666 | 0 |
| 0.8298611111111112 | 0 |
| 0.8305555555555556 | 0 |
| 0.8312499999999999 | 0 |
| 0.8319444444444444 | 0 |
| 0.8326388888888889 | 0 |
| 0.8333333333333334 | 0 |
| 0.8340277777777777 | 0 |
| 0.8347222222222223 | 0 |
| 0.8354166666666667 | 0 |
| 0.8361111111111111 | 0 |
| 0.8368055555555555 | 0 |
| 0.8375 | 0 |
| 0.8381944444444445 | 0 |
| 0.8388888888888889 | 0 |
| 0.8395833333333332 | 0 |
| 0.8402777777777778 | 0 |
| 0.8409722222222222 | 0 |
| 0.8416666666666667 | 0 |
| 0.842361111111111 | 0 |
| 0.8430555555555556 | 0 |
| 0.84375 | 0 |
| 0.8444444444444444 | 0 |
| 0.845138888888889 | 0 |
| 0.8458333333333333 | 0 |
| 0.8465277777777778 | 0 |
| 0.8472222222222222 | 0 |
| 0.8479166666666668 | 0 |
| 0.8486111111111111 | 0 |
| 0.8493055555555555 | 0 |
| 0.85 | 0 |
| 0.8506944444444445 | 0 |
| 0.8513888888888889 | 0 |
| 0.8520833333333333 | 0 |
| 0.8527777777777777 | 0 |
| 0.8534722222222223 | 0 |
| 0.8541666666666666 | 0 |
| 0.8548611111111111 | 0 |
| 0.8555555555555556 | 0 |
| 0.8562500000000001 | 0 |
| 0.8569444444444444 | 0 |
| 0.8576388888888888 | 0 |
| 0.8583333333333334 | 0 |
| 0.8590277777777778 | 0 |
| 0.8597222222222222 | 0 |
| 0.8604166666666666 | 0 |
| 0.8611111111111112 | 0 |
| 0.8618055555555556 | 0 |
| 0.8624999999999999 | 0 |
| 0.8631944444444444 | 0 |
| 0.8638888888888889 | 0 |
| 0.8645833333333334 | 0 |
| 0.8652777777777777 | 0 |
| 0.8659722222222223 | 0 |
| 0.8666666666666667 | 0 |
| 0.8673611111111111 | 0 |
| 0.8680555555555555 | 0 |
| 0.86875 | 0 |
| 0.8694444444444445 | 0 |
| 0.8701388888888889 | 0 |
| 0.8708333333333332 | 0 |
| 0.8715277777777778 | 0 |
| 0.8722222222222222 | 0 |
| 0.8729166666666667 | 0 |
| 0.873611111111111 | 0 |
| 0.8743055555555556 | 0 |
| 0.875 | 0 |
| 0.8756944444444444 | 0 |
| 0.876388888888889 | 0 |
| 0.8770833333333333 | 0 |
| 0.8777777777777778 | 0 |
| 0.8784722222222222 | 0 |
| 0.8791666666666668 | 0 |
| 0.8798611111111111 | 0 |
| 0.8805555555555555 | 0 |
| 0.88125 | 0 |
| 0.8819444444444445 | 0 |
| 0.8826388888888889 | 0 |
| 0.8833333333333333 | 0 |
| 0.8840277777777777 | 0 |
| 0.8847222222222223 | 0 |
| 0.8854166666666666 | 0 |
| 0.8861111111111111 | 0 |
| 0.8868055555555556 | 0 |
| 0.8875000000000001 | 0 |
| 0.8881944444444444 | 0 |
| 0.8888888888888888 | 0 |
| 0.8895833333333334 | 0 |
| 0.8902777777777778 | 0 |
| 0.8909722222222222 | 0 |
| 0.8916666666666666 | 0 |
| 0.8923611111111112 | 0 |
| 0.8930555555555556 | 0 |
| 0.8937499999999999 | 0 |
| 0.8944444444444444 | 0 |
| 0.8951388888888889 | 0 |
| 0.8958333333333334 | 0 |
| 0.8965277777777777 | 0 |
| 0.8972222222222223 | 0 |
| 0.8979166666666667 | 0 |
| 0.8986111111111111 | 0 |
| 0.8993055555555555 | 0 |
| 0.9 | 0 |
| 0.9006944444444445 | 0 |
| 0.9013888888888889 | 0 |
| 0.9020833333333332 | 0 |
| 0.9027777777777778 | 0 |
| 0.9034722222222222 | 0 |
| 0.9041666666666667 | 0 |
| 0.904861111111111 | 0 |
| 0.9055555555555556 | 0 |
| 0.90625 | 0 |
| 0.9069444444444444 | 0 |
| 0.907638888888889 | 0 |
| 0.9083333333333333 | 0 |
| 0.9090277777777778 | 0 |
| 0.9097222222222222 | 0 |
| 0.9104166666666668 | 0 |
| 0.9111111111111111 | 0 |
| 0.9118055555555555 | 0 |
| 0.9125 | 0 |
| 0.9131944444444445 | 0 |
| 0.9138888888888889 | 0 |
| 0.9145833333333333 | 0 |
| 0.9152777777777777 | 0 |
| 0.9159722222222223 | 0 |
| 0.9166666666666666 | 0 |
| 0.9173611111111111 | 0 |
| 0.9180555555555556 | 0 |
| 0.9187500000000001 | 0 |
| 0.9194444444444444 | 0 |
| 0.9201388888888888 | 0 |
| 0.9208333333333334 | 0 |
| 0.9215277777777778 | 0 |
| 0.9222222222222222 | 0 |
| 0.9229166666666666 | 0 |
| 0.9236111111111112 | 0 |
| 0.9243055555555556 | 0 |
| 0.9249999999999999 | 0 |
| 0.9256944444444444 | 0 |
| 0.9263888888888889 | 0 |
| 0.9270833333333334 | 0 |
| 0.9277777777777777 | 0 |
| 0.9284722222222223 | 0 |
| 0.9291666666666667 | 0 |
| 0.9298611111111111 | 0 |
| 0.9305555555555555 | 0 |
| 0.93125 | 0 |
| 0.9319444444444445 | 0 |
| 0.9326388888888889 | 0 |
| 0.9333333333333332 | 0 |
| 0.9340277777777778 | 0 |
| 0.9347222222222222 | 0 |
| 0.9354166666666667 | 0 |
| 0.936111111111111 | 0 |
| 0.9368055555555556 | 0 |
| 0.9375 | 0 |
| 0.9381944444444444 | 0 |
| 0.938888888888889 | 0 |
| 0.9395833333333333 | 0 |
| 0.9402777777777778 | 0 |
| 0.9409722222222222 | 0 |
| 0.9416666666666668 | 0 |
| 0.9423611111111111 | 0 |
| 0.9430555555555555 | 0 |
| 0.94375 | 0 |
| 0.9444444444444445 | 0 |
| 0.9451388888888889 | 0 |
| 0.9458333333333333 | 0 |
| 0.9465277777777777 | 0 |
| 0.9472222222222223 | 0 |
| 0.9479166666666666 | 0 |
| 0.9486111111111111 | 0 |
| 0.9493055555555556 | 0 |
| 0.9500000000000001 | 0 |
| 0.9506944444444444 | 0 |
| 0.9513888888888888 | 0 |
| 0.9520833333333334 | 0 |
| 0.9527777777777778 | 0 |
| 0.9534722222222222 | 0 |
| 0.9541666666666666 | 0 |
| 0.9548611111111112 | 0 |
| 0.9555555555555556 | 0 |
| 0.9562499999999999 | 0 |
| 0.9569444444444444 | 0 |
| 0.9576388888888889 | 0 |
| 0.9583333333333334 | 0 |
| 0.9590277777777777 | 0 |
| 0.9597222222222223 | 0 |
| 0.9604166666666667 | 0 |
| 0.9611111111111111 | 0 |
| 0.9618055555555555 | 0 |
| 0.9625 | 0 |
| 0.9631944444444445 | 0 |
| 0.9638888888888889 | 0 |
| 0.9645833333333332 | 0 |
| 0.9652777777777778 | 0 |
| 0.9659722222222222 | 0 |
| 0.9666666666666667 | 0 |
| 0.967361111111111 | 0 |
| 0.9680555555555556 | 0 |
| 0.96875 | 0 |
| 0.9694444444444444 | 0 |
| 0.970138888888889 | 0 |
| 0.9708333333333333 | 0 |
| 0.9715277777777778 | 0 |
| 0.9722222222222222 | 0 |
| 0.9729166666666668 | 0 |
| 0.9736111111111111 | 0 |
| 0.9743055555555555 | 0 |
| 0.975 | 0 |
| 0.9756944444444445 | 0 |
| 0.9763888888888889 | 0 |
| 0.9770833333333333 | 0 |
| 0.9777777777777777 | 0 |
| 0.9784722222222223 | 0 |
| 0.9791666666666666 | 0 |
| 0.9798611111111111 | 0 |
| 0.9805555555555556 | 0 |
| 0.9812500000000001 | 0 |
| 0.9819444444444444 | 0 |
| 0.9826388888888888 | 0 |
| 0.9833333333333334 | 0 |
| 0.9840277777777778 | 0 |
| 0.9847222222222222 | 0 |
| 0.9854166666666666 | 0 |
| 0.9861111111111112 | 0 |
| 0.9868055555555556 | 0 |
| 0.9874999999999999 | 0 |
| 0.9881944444444444 | 0 |
| 0.9888888888888889 | 0 |
| 0.9895833333333334 | 0 |
| 0.9902777777777777 | 0 |
| 0.9909722222222223 | 0 |
| 0.9916666666666667 | 0 |
| 0.9923611111111111 | 0 |
| 0.9930555555555555 | 0 |
| 0.99375 | 0 |
| 0.9944444444444445 | 0 |
| 0.9951388888888889 | 0 |
| 0.9958333333333332 | 0 |
| 0.9965277777777778 | 0 |
| 0.9972222222222222 | 0 |
| 0.9979166666666667 | 0 |
| 0.998611111111111 | 0 |
| 0.9993055555555556 | 0 |